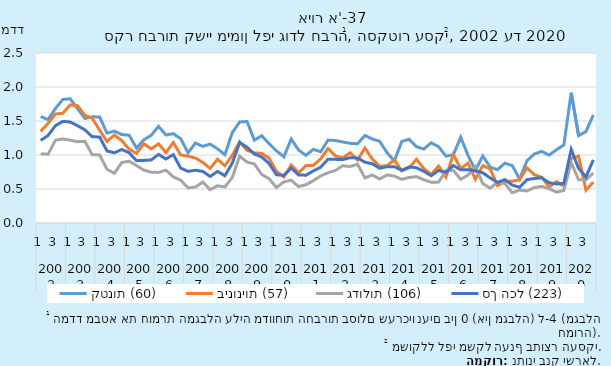
| Category | קטנות (60) | בינוניות (57) | גדולות (106) | סך הכל (223) |
|---|---|---|---|---|
| 0 | 1.566 | 1.348 | 1.017 | 1.214 |
| 1 | 1.52 | 1.464 | 1.011 | 1.287 |
| 2 | 1.684 | 1.603 | 1.217 | 1.431 |
| 3 | 1.816 | 1.613 | 1.235 | 1.494 |
| 4 | 1.827 | 1.737 | 1.219 | 1.485 |
| 5 | 1.685 | 1.725 | 1.196 | 1.432 |
| 6 | 1.537 | 1.584 | 1.201 | 1.37 |
| 7 | 1.562 | 1.54 | 1.003 | 1.269 |
| 8 | 1.559 | 1.364 | 1.001 | 1.265 |
| 9 | 1.322 | 1.199 | 0.791 | 1.06 |
| 10 | 1.351 | 1.295 | 0.732 | 1.032 |
| 11 | 1.301 | 1.211 | 0.89 | 1.081 |
| 12 | 1.291 | 1.087 | 0.909 | 1.034 |
| 13 | 1.103 | 1.024 | 0.845 | 0.917 |
| 14 | 1.223 | 1.165 | 0.779 | 0.92 |
| 15 | 1.291 | 1.091 | 0.746 | 0.927 |
| 16 | 1.421 | 1.164 | 0.744 | 1.009 |
| 17 | 1.294 | 1.035 | 0.776 | 0.941 |
| 18 | 1.313 | 1.184 | 0.678 | 1.006 |
| 19 | 1.24 | 1 | 0.631 | 0.808 |
| 20 | 1.033 | 0.983 | 0.515 | 0.759 |
| 21 | 1.176 | 0.955 | 0.529 | 0.776 |
| 22 | 1.127 | 0.891 | 0.602 | 0.759 |
| 23 | 1.16 | 0.804 | 0.491 | 0.684 |
| 24 | 1.09 | 0.937 | 0.547 | 0.759 |
| 25 | 1.005 | 0.843 | 0.531 | 0.695 |
| 26 | 1.33 | 0.995 | 0.667 | 0.88 |
| 27 | 1.485 | 1.192 | 0.983 | 1.185 |
| 28 | 1.494 | 1.069 | 0.895 | 1.115 |
| 29 | 1.218 | 1.03 | 0.869 | 1.015 |
| 30 | 1.283 | 1.025 | 0.714 | 0.97 |
| 31 | 1.166 | 0.951 | 0.651 | 0.875 |
| 32 | 1.061 | 0.76 | 0.522 | 0.71 |
| 33 | 0.974 | 0.677 | 0.605 | 0.702 |
| 34 | 1.235 | 0.851 | 0.629 | 0.808 |
| 35 | 1.074 | 0.739 | 0.536 | 0.707 |
| 36 | 0.995 | 0.843 | 0.563 | 0.703 |
| 37 | 1.083 | 0.847 | 0.622 | 0.766 |
| 38 | 1.047 | 0.944 | 0.693 | 0.82 |
| 39 | 1.219 | 1.096 | 0.739 | 0.939 |
| 40 | 1.213 | 0.985 | 0.773 | 0.936 |
| 41 | 1.192 | 0.958 | 0.842 | 0.933 |
| 42 | 1.172 | 1.033 | 0.831 | 0.961 |
| 43 | 1.166 | 0.924 | 0.865 | 0.957 |
| 44 | 1.287 | 1.102 | 0.664 | 0.894 |
| 45 | 1.236 | 0.941 | 0.705 | 0.871 |
| 46 | 1.201 | 0.834 | 0.648 | 0.805 |
| 47 | 1.035 | 0.842 | 0.706 | 0.828 |
| 48 | 0.914 | 0.929 | 0.69 | 0.828 |
| 49 | 1.199 | 0.766 | 0.642 | 0.775 |
| 50 | 1.232 | 0.811 | 0.67 | 0.824 |
| 51 | 1.121 | 0.937 | 0.682 | 0.812 |
| 52 | 1.087 | 0.799 | 0.636 | 0.759 |
| 53 | 1.18 | 0.714 | 0.6 | 0.696 |
| 54 | 1.122 | 0.838 | 0.601 | 0.772 |
| 55 | 0.984 | 0.677 | 0.765 | 0.748 |
| 56 | 1.003 | 1.01 | 0.776 | 0.845 |
| 57 | 1.262 | 0.798 | 0.643 | 0.782 |
| 58 | 0.991 | 0.881 | 0.704 | 0.785 |
| 59 | 0.775 | 0.643 | 0.83 | 0.768 |
| 60 | 0.986 | 0.843 | 0.58 | 0.739 |
| 61 | 0.822 | 0.795 | 0.512 | 0.663 |
| 62 | 0.784 | 0.549 | 0.598 | 0.596 |
| 63 | 0.88 | 0.613 | 0.581 | 0.638 |
| 64 | 0.845 | 0.615 | 0.445 | 0.557 |
| 65 | 0.645 | 0.638 | 0.484 | 0.526 |
| 66 | 0.917 | 0.81 | 0.472 | 0.638 |
| 67 | 1.015 | 0.709 | 0.522 | 0.654 |
| 68 | 1.053 | 0.673 | 0.538 | 0.666 |
| 69 | 0.999 | 0.529 | 0.505 | 0.593 |
| 70 | 1.077 | 0.609 | 0.453 | 0.574 |
| 71 | 1.147 | 0.54 | 0.479 | 0.582 |
| 72 | 1.916 | 0.95 | 0.89 | 1.083 |
| 73 | 1.285 | 0.983 | 0.635 | 0.804 |
| 74 | 1.345 | 0.483 | 0.635 | 0.677 |
| 75 | 1.589 | 0.602 | 0.736 | 0.929 |